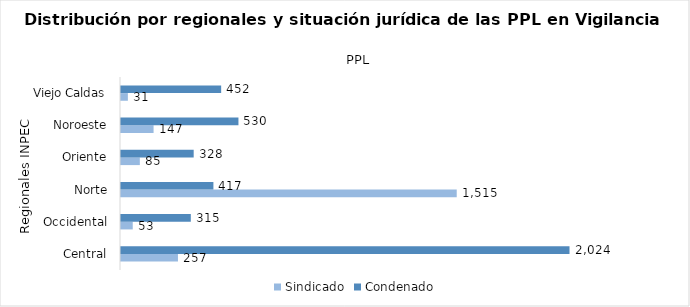
| Category | Sindicado | Condenado |
|---|---|---|
| Central | 257 | 2024 |
| Occidental | 53 | 315 |
| Norte | 1515 | 417 |
| Oriente | 85 | 328 |
| Noroeste | 147 | 530 |
| Viejo Caldas | 31 | 452 |